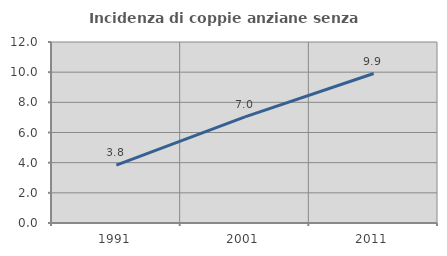
| Category | Incidenza di coppie anziane senza figli  |
|---|---|
| 1991.0 | 3.843 |
| 2001.0 | 7.038 |
| 2011.0 | 9.911 |